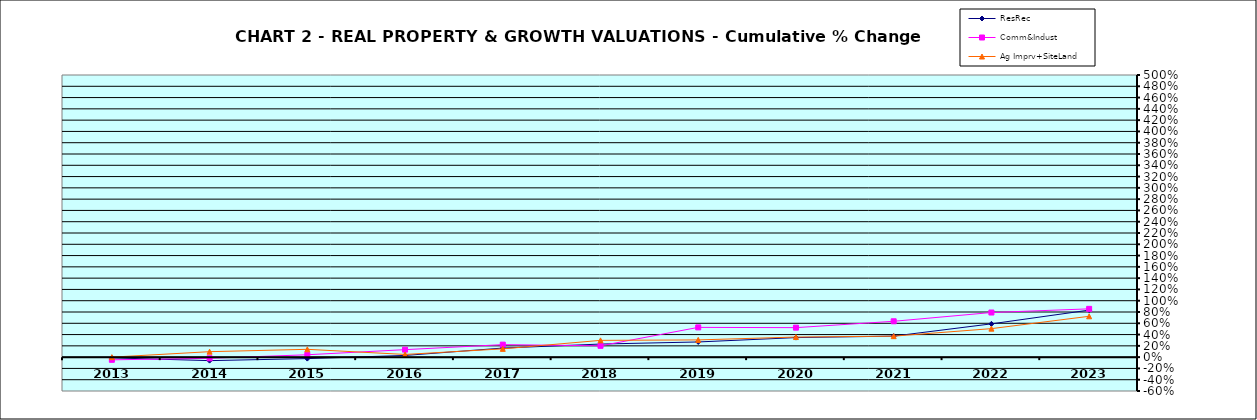
| Category | ResRec | Comm&Indust | Ag Imprv+SiteLand |
|---|---|---|---|
| 2013.0 | -0.013 | -0.048 | 0 |
| 2014.0 | -0.062 | -0.02 | 0.097 |
| 2015.0 | -0.026 | 0.042 | 0.139 |
| 2016.0 | 0.03 | 0.133 | 0.048 |
| 2017.0 | 0.161 | 0.222 | 0.147 |
| 2018.0 | 0.232 | 0.201 | 0.297 |
| 2019.0 | 0.269 | 0.527 | 0.305 |
| 2020.0 | 0.346 | 0.523 | 0.356 |
| 2021.0 | 0.373 | 0.635 | 0.372 |
| 2022.0 | 0.59 | 0.791 | 0.505 |
| 2023.0 | 0.833 | 0.856 | 0.724 |